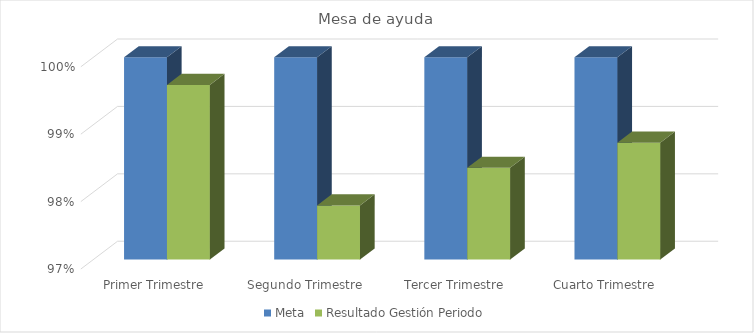
| Category | Meta | Resultado Gestión Periodo |
|---|---|---|
| Primer Trimestre | 1 | 0.996 |
| Segundo Trimestre | 1 | 0.978 |
| Tercer Trimestre | 1 | 0.984 |
| Cuarto Trimestre | 1 | 0.987 |